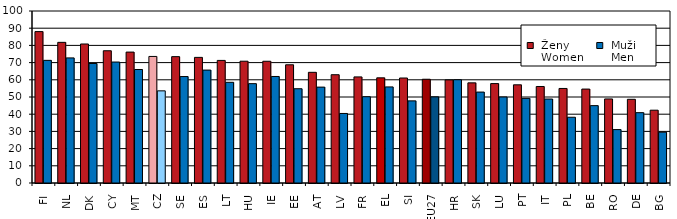
| Category |  Ženy 
 Women |  Muži 
 Men |
|---|---|---|
| FI | 88.027 | 71.306 |
| NL | 81.77 | 72.737 |
| DK | 80.817 | 69.478 |
| CY | 76.887 | 70.33 |
| MT | 76.111 | 65.986 |
| CZ | 73.577 | 53.572 |
| SE | 73.472 | 61.883 |
| ES | 73.034 | 65.644 |
| LT | 71.268 | 58.546 |
| HU | 70.81 | 57.766 |
| IE | 70.78 | 61.933 |
| EE | 68.723 | 54.812 |
| AT | 64.35 | 55.742 |
| LV | 62.955 | 40.429 |
| FR | 61.689 | 50.17 |
| EL | 61.142 | 55.865 |
| SI | 61.046 | 47.75 |
| EU27 | 60.323 | 50.099 |
| HR | 59.942 | 60.052 |
| SK | 58.218 | 52.868 |
| LU | 57.801 | 50.017 |
| PT | 57.084 | 49.212 |
| IT | 56.105 | 48.825 |
| PL | 54.967 | 38.228 |
| BE | 54.607 | 44.981 |
| RO | 48.876 | 31.052 |
| DE | 48.663 | 40.892 |
| BG | 42.329 | 29.543 |